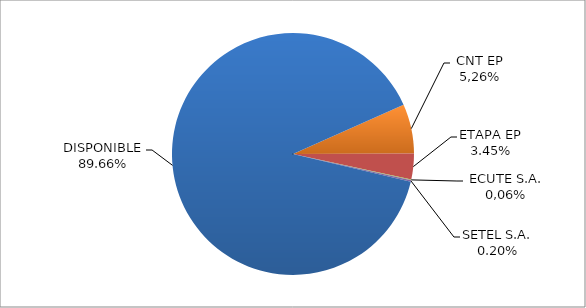
| Category | CODIGO DE AREA 7 |
|---|---|
| CORPORACIÓN NACIONAL TELECOMUNICACIONES CNT EP | 0.066 |
| ETAPA EP | 0.035 |
| CONECEL S.A. (ECUADORTELECOM S.A.) | 0.001 |
| SETEL S.A. | 0.002 |
| DISPONIBLE | 0.897 |